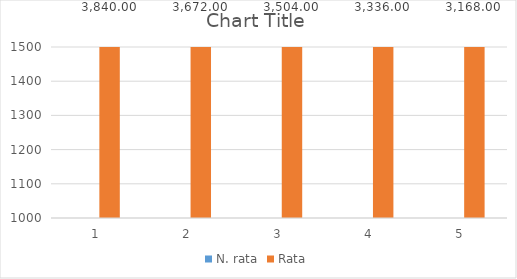
| Category | N. rata | Rata |
|---|---|---|
| 0 | 1 | 3840 |
| 1 | 2 | 3672 |
| 2 | 3 | 3504 |
| 3 | 4 | 3336 |
| 4 | 5 | 3168 |